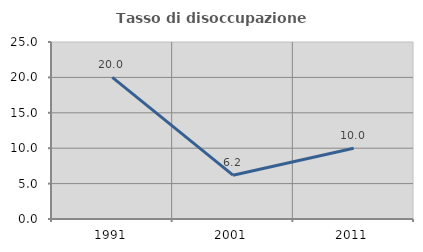
| Category | Tasso di disoccupazione giovanile  |
|---|---|
| 1991.0 | 20 |
| 2001.0 | 6.186 |
| 2011.0 | 10 |